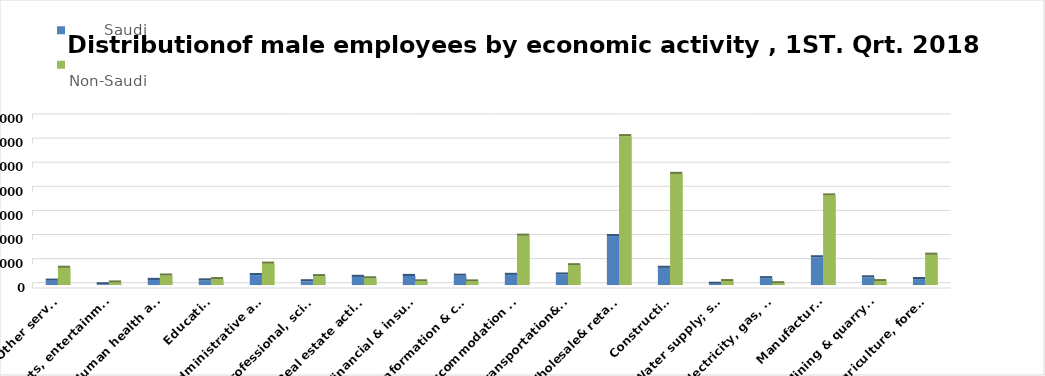
| Category |        Saudi      |          Non-Saudi        |
|---|---|---|
| Agriculture, forestry & fishing | 49458 | 251345 |
| Mining & quarrying | 63758 | 32201 |
| Manufacturing | 230214 | 743219 |
| Electricity, gas, steam & air conditioning supply | 56550 | 14362 |
| Water supply; sewerage, waste remediation  | 10180 | 32174 |
| Construction | 142650 | 922018 |
| Wholesale& retail trade; repair of motor vehicles | 405812 | 1235027 |
| Transportation& storage | 87225 | 164032 |
| Accommodation & food service activities | 84102 | 408909 |
| Information & communication | 77118 | 29818 |
| Financial & insurance | 75143 | 30453 |
| Real estate activities | 67569 | 55361 |
| Professional, scientific & technical activities | 31070 | 73449 |
| Administrative and support service activities | 82601 | 177214 |
| Education | 38304 | 48801 |
| Human health and &l work activities | 42305 | 78768 |
| Arts, entertainment & recreation | 5862 | 20931 |
| Other service | 36116 | 142901 |